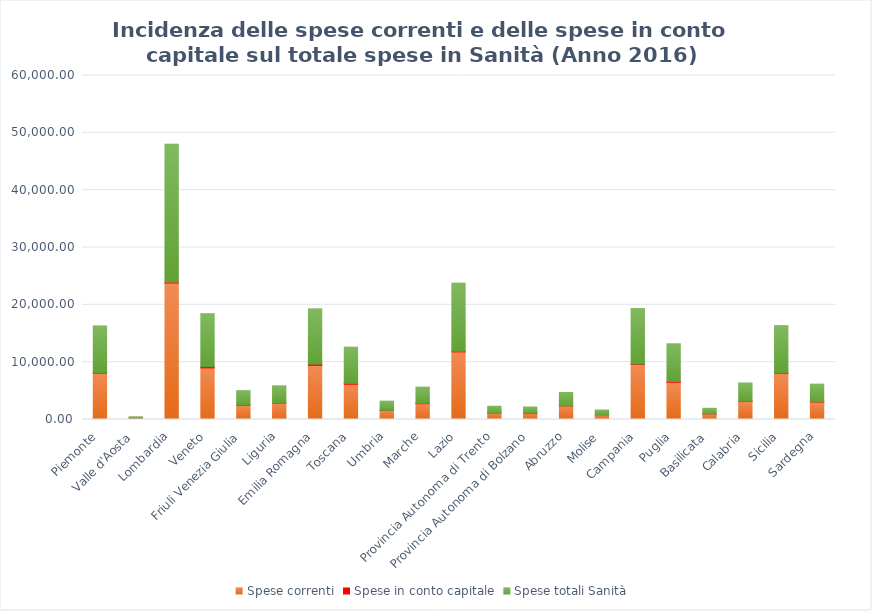
| Category | Spese correnti | Spese in conto capitale | Spese totali Sanità  |
|---|---|---|---|
| Piemonte | 8064.391 | 98.711 | 8163.102 |
| Valle d'Aosta | 229.435 | 6.887 | 236.322 |
| Lombardia | 23812.846 | 186.27 | 23999.116 |
| Veneto | 9002.448 | 226.221 | 9228.669 |
| Friuli Venezia Giulia | 2475.923 | 42.115 | 2518.038 |
| Liguria | 2865.635 | 72.87 | 2938.506 |
| Emilia Romagna | 9444.599 | 210.249 | 9654.848 |
| Toscana | 6149.797 | 151.728 | 6301.525 |
| Umbria | 1574.747 | 19.133 | 1593.88 |
| Marche | 2760.591 | 56.178 | 2816.769 |
| Lazio | 11796.44 | 90.343 | 11886.783 |
| Provincia Autonoma di Trento | 1119.207 | 32.324 | 1151.531 |
| Provincia Autonoma di Bolzano | 1036.429 | 45.41 | 1081.838 |
| Abruzzo | 2316.648 | 41.396 | 2358.044 |
| Molise | 810.965 | 5.117 | 816.082 |
| Campania | 9603.853 | 73.687 | 9677.54 |
| Puglia | 6475.036 | 129.88 | 6604.915 |
| Basilicata | 957.247 | 17.765 | 975.011 |
| Calabria | 3156.832 | 31.418 | 3188.25 |
| Sicilia | 8078.164 | 110.001 | 8188.166 |
| Sardegna | 3015.664 | 62.101 | 3077.766 |